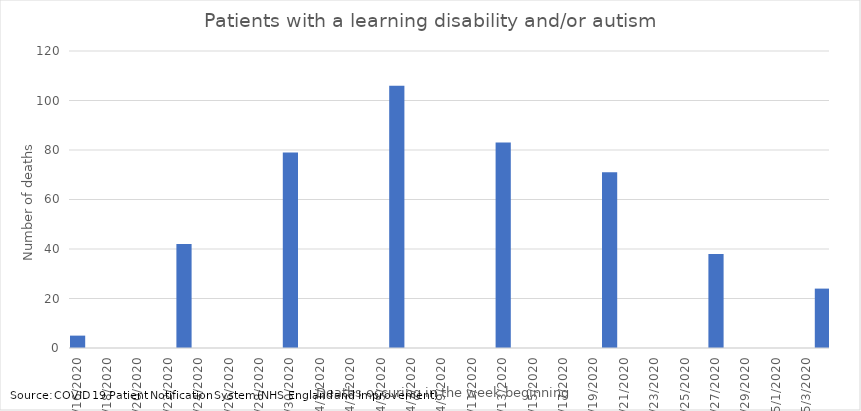
| Category | Number of cases |
|---|---|
| 16/03/2020 | 5 |
| 23/03/2020 | 42 |
| 30/03/2020 | 79 |
| 06/04/2020 | 106 |
| 13/04/2020 | 83 |
| 20/04/2020 | 71 |
| 27/04/2020 | 38 |
| 04/05/2020 | 24 |